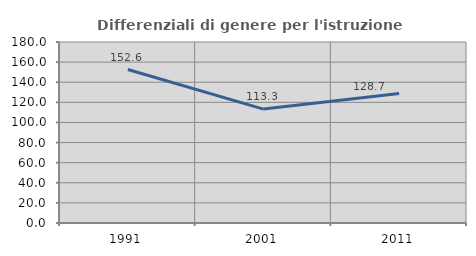
| Category | Differenziali di genere per l'istruzione superiore |
|---|---|
| 1991.0 | 152.642 |
| 2001.0 | 113.275 |
| 2011.0 | 128.687 |